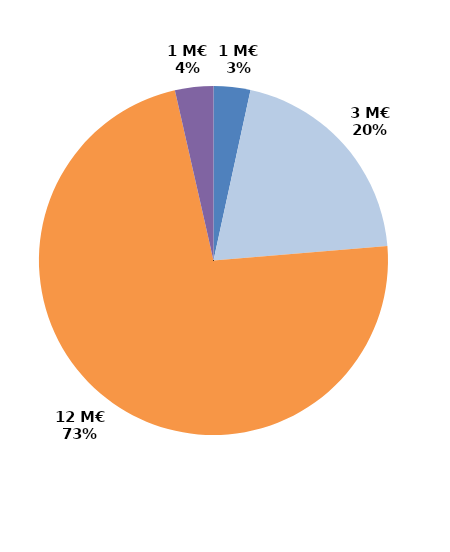
| Category | Series 0 |
|---|---|
| CIF - CPF | 0.561 |
| Période de professionnalisation | 3.337 |
| Plan de formation | 11.979 |
| Autres | 0.585 |